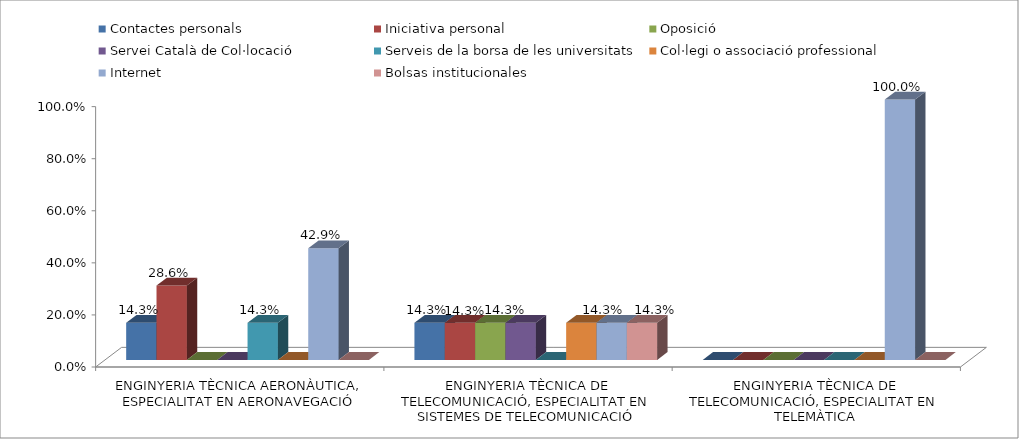
| Category | Contactes personals | Iniciativa personal | Oposició | Servei Català de Col·locació | Serveis de la borsa de les universitats | Col·legi o associació professional | Internet | Bolsas institucionales |
|---|---|---|---|---|---|---|---|---|
| ENGINYERIA TÈCNICA AERONÀUTICA, ESPECIALITAT EN AERONAVEGACIÓ | 0.143 | 0.286 | 0 | 0 | 0.143 | 0 | 0.429 | 0 |
| ENGINYERIA TÈCNICA DE TELECOMUNICACIÓ, ESPECIALITAT EN SISTEMES DE TELECOMUNICACIÓ | 0.143 | 0.143 | 0.143 | 0.143 | 0 | 0.143 | 0.143 | 0.143 |
| ENGINYERIA TÈCNICA DE TELECOMUNICACIÓ, ESPECIALITAT EN TELEMÀTICA | 0 | 0 | 0 | 0 | 0 | 0 | 1 | 0 |